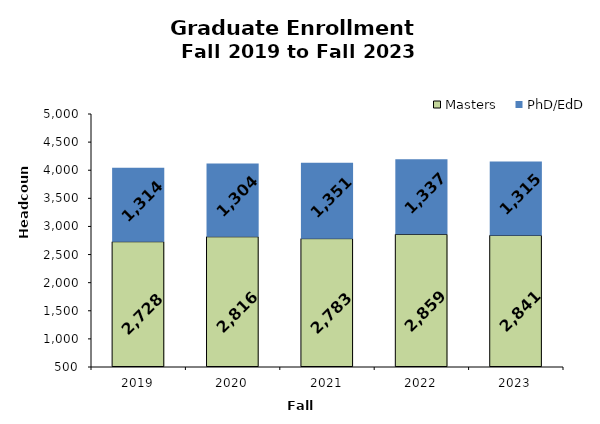
| Category | Masters | PhD/EdD |
|---|---|---|
| 2019.0 | 2728 | 1314 |
| 2020.0 | 2816 | 1304 |
| 2021.0 | 2783 | 1351 |
| 2022.0 | 2859 | 1337 |
| 2023.0 | 2841 | 1315 |